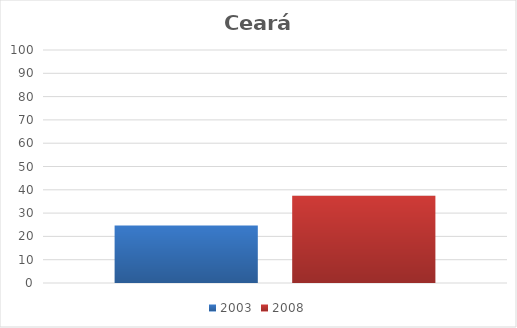
| Category | 2003 | 2008 |
|---|---|---|
| Total | 24.7 | 37.5 |